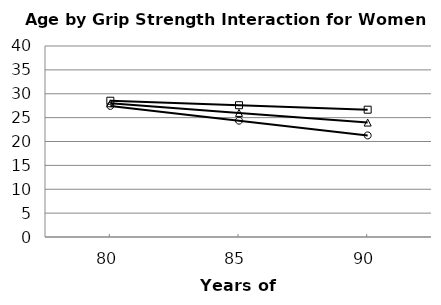
| Category | Grip = 12 | Grip = 9 | Grip = 6 |
|---|---|---|---|
| 80.0 | 28.541 | 27.998 | 27.456 |
| 85.0 | 27.6 | 25.982 | 24.365 |
| 90.0 | 26.659 | 23.966 | 21.273 |